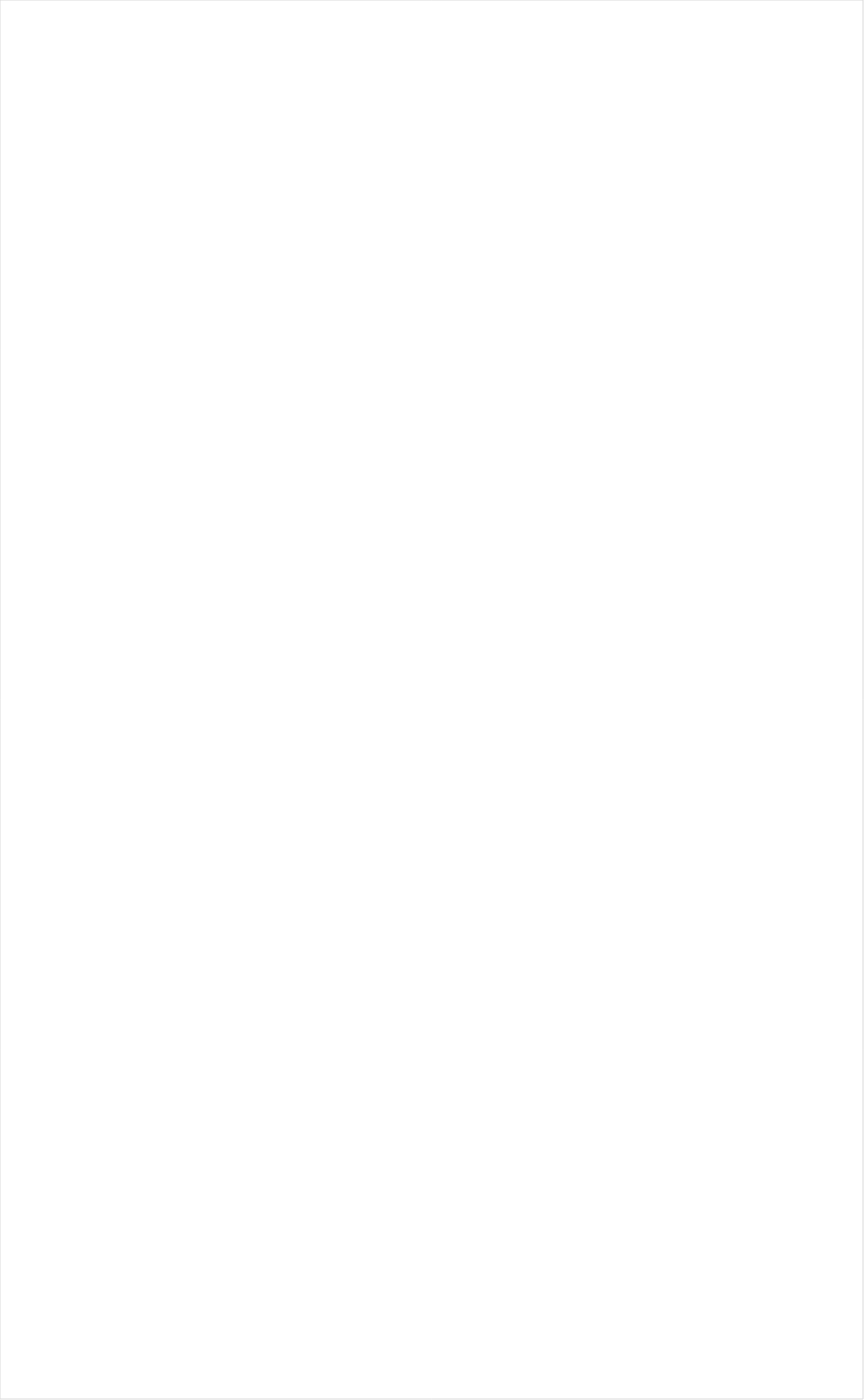
| Category | Total |
|---|---|
| RFD TV | -0.288 |
| PBS | -0.193 |
| Hallmark Movies & Mysteries | -0.193 |
| INSP | -0.184 |
| Fox Business | -0.182 |
| Smithsonian | -0.162 |
| MSNBC | -0.154 |
| Fox News | -0.132 |
| American Heroes Channel | -0.131 |
| Hallmark | -0.13 |
| Science Channel | -0.129 |
| PAC-12 Network | -0.124 |
| SundanceTV | -0.12 |
| Tennis Channel | -0.117 |
| National Geographic Wild | -0.117 |
| CBS | -0.115 |
| Weather Channel | -0.107 |
| Reelz Channel | -0.1 |
| DIY | -0.092 |
| CNN | -0.088 |
| NHL | -0.086 |
| MyNetworkTV | -0.086 |
| History Channel | -0.083 |
| Motor Trend Network | -0.081 |
| National Geographic | -0.078 |
| NBC | -0.076 |
| FYI | -0.074 |
| Outdoor Channel | -0.074 |
| NBC Sports | -0.071 |
| Cooking Channel | -0.07 |
| Great American Country | -0.068 |
| Bloomberg HD | -0.068 |
| HGTV | -0.065 |
| Golf | -0.065 |
| MLB Network | -0.06 |
| WGN America | -0.058 |
| ABC | -0.057 |
| Investigation Discovery | -0.055 |
| ION | -0.055 |
| Game Show | -0.055 |
| POP | -0.051 |
| Destination America | -0.05 |
| Animal Planet | -0.05 |
| Discovery Channel | -0.043 |
| CW | -0.042 |
| TV LAND | -0.039 |
| BBC America | -0.036 |
| ESPNU | -0.036 |
| Logo | -0.035 |
| Headline News | -0.035 |
| Oprah Winfrey Network | -0.034 |
| Travel | -0.032 |
| UP TV | -0.031 |
| Ovation | -0.025 |
| FOX | -0.025 |
| AMC | -0.024 |
| Fox Sports 1 | -0.022 |
| FX Movie Channel | -0.02 |
| Independent Film (IFC) | -0.015 |
| OXYGEN | -0.013 |
| Discovery Family Channel | -0.012 |
| Big Ten Network | -0.011 |
| WE TV | -0.007 |
| A&E | -0.005 |
| CMTV | -0.005 |
| Food Network | -0.004 |
| Olympic Channel | 0.004 |
| ESPNEWS | 0.008 |
| Discovery Life Channel | 0.012 |
| The Sportsman Channel | 0.012 |
| CNBC | 0.019 |
| TLC | 0.02 |
| Paramount Network | 0.028 |
| USA Network | 0.029 |
| Lifetime | 0.031 |
| FXDEP | 0.037 |
| CBS Sports | 0.037 |
| TBS | 0.038 |
| Viceland | 0.041 |
| NFL Network | 0.042 |
| BRAVO | 0.044 |
| FX | 0.045 |
| SYFY | 0.046 |
| TNT | 0.047 |
| TV ONE | 0.056 |
| ESPN | 0.061 |
| ESPN2 | 0.07 |
| Freeform | 0.073 |
| E! | 0.076 |
| Lifetime Movies | 0.079 |
| BET Her | 0.086 |
| Comedy Central | 0.091 |
| NBA TV | 0.092 |
| MTV2 | 0.094 |
| truTV | 0.096 |
| Disney Channel | 0.102 |
| Disney XD | 0.108 |
| FXX | 0.114 |
| BET | 0.121 |
| Nick Toons | 0.125 |
| NBC Universo | 0.141 |
| Univision | 0.147 |
| Nick@Nite | 0.149 |
| Cartoon Network | 0.149 |
| Universal Kids | 0.151 |
| MTV | 0.159 |
| Teen Nick | 0.164 |
| Nick | 0.177 |
| VH1 | 0.187 |
| Telemundo | 0.205 |
| Adult Swim | 0.216 |
| TUDN | 0.226 |
| Galavision | 0.229 |
| ESPN Deportes | 0.231 |
| UniMas | 0.233 |
| Nick Jr. | 0.312 |
| Disney Junior US | 0.319 |